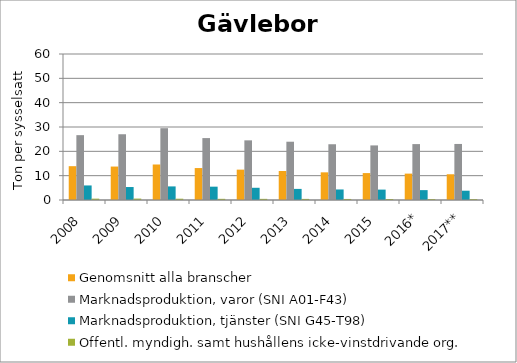
| Category | Genomsnitt alla branscher | Marknadsproduktion, varor (SNI A01-F43) | Marknadsproduktion, tjänster (SNI G45-T98) | Offentl. myndigh. samt hushållens icke-vinstdrivande org. |
|---|---|---|---|---|
| 2008 | 13.899 | 26.651 | 5.981 | 0.555 |
| 2009 | 13.744 | 27.021 | 5.33 | 0.58 |
| 2010 | 14.593 | 29.509 | 5.586 | 0.53 |
| 2011 | 13.127 | 25.447 | 5.478 | 0.48 |
| 2012 | 12.479 | 24.515 | 5.023 | 0.47 |
| 2013 | 11.918 | 23.953 | 4.562 | 0.454 |
| 2014 | 11.367 | 22.914 | 4.329 | 0.431 |
| 2015 | 11.059 | 22.433 | 4.271 | 0.421 |
| 2016* | 10.844 | 22.974 | 4.059 | 0.378 |
| 2017** | 10.578 | 23.032 | 3.817 | 0.36 |